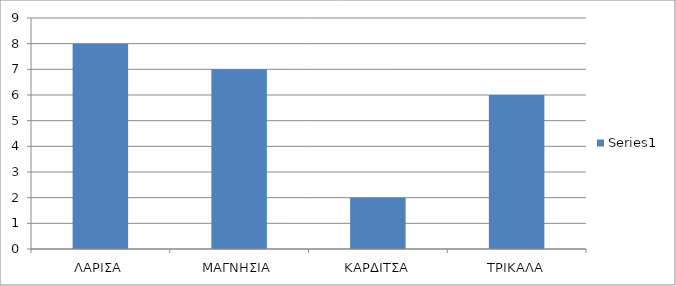
| Category | Series 0 |
|---|---|
| ΛΑΡΙΣΑ | 8 |
| ΜΑΓΝΗΣΙΑ | 7 |
| ΚΑΡΔΙΤΣΑ | 2 |
| ΤΡΙΚΑΛΑ | 6 |